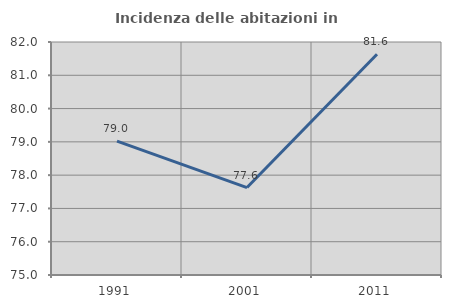
| Category | Incidenza delle abitazioni in proprietà  |
|---|---|
| 1991.0 | 79.02 |
| 2001.0 | 77.627 |
| 2011.0 | 81.63 |